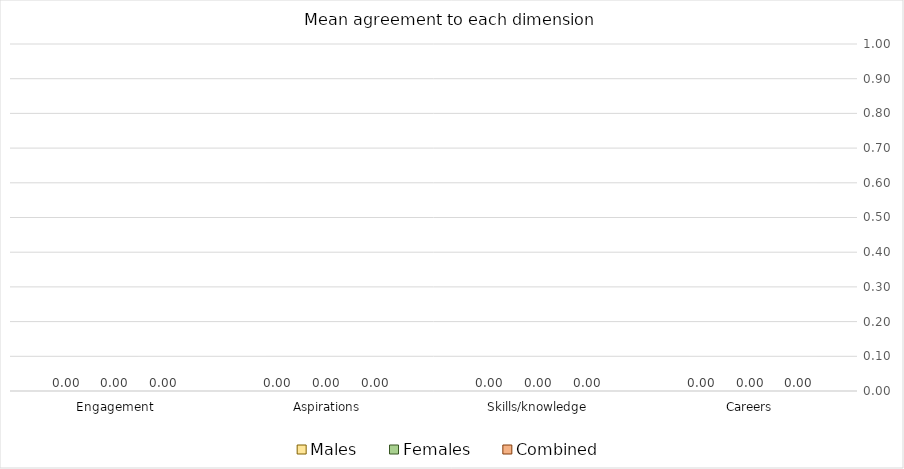
| Category | Males | Females | Combined  |
|---|---|---|---|
| Engagement | 0 | 0 | 0 |
| Aspirations | 0 | 0 | 0 |
| Skills/knowledge | 0 | 0 | 0 |
| Careers | 0 | 0 | 0 |